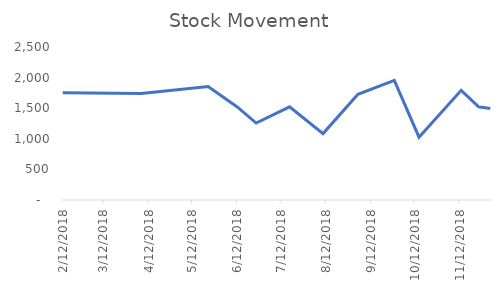
| Category | Stock Movement |
|---|---|
| 2/12/18 | 1754 |
| 4/7/18 | 1739 |
| 5/23/18 | 1853 |
| 6/12/18 | 1520 |
| 6/25/18 | 1257 |
| 7/18/18 | 1523 |
| 8/10/18 | 1085 |
| 9/3/18 | 1727 |
| 9/28/18 | 1955 |
| 10/15/18 | 1026 |
| 11/13/18 | 1792 |
| 11/25/18 | 1523 |
| 12/3/18 | 1495 |